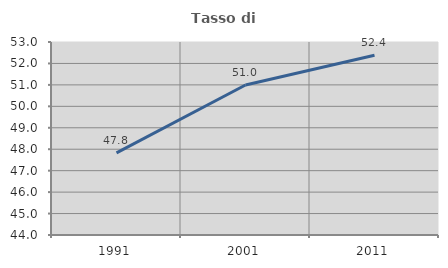
| Category | Tasso di occupazione   |
|---|---|
| 1991.0 | 47.833 |
| 2001.0 | 50.993 |
| 2011.0 | 52.384 |